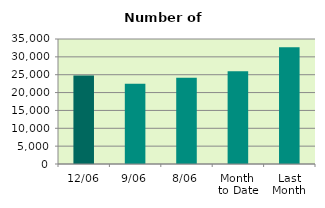
| Category | Series 0 |
|---|---|
| 12/06 | 24768 |
| 9/06 | 22482 |
| 8/06 | 24156 |
| Month 
to Date | 25969.5 |
| Last
Month | 32723.818 |